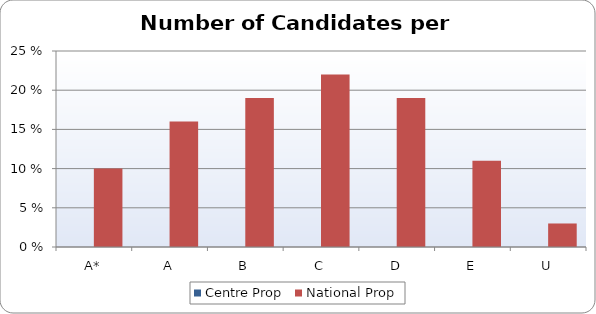
| Category | Centre Prop | National Prop |
|---|---|---|
| A* | 0 | 10 |
| A | 0 | 16 |
| B | 0 | 19 |
| C | 0 | 22 |
| D | 0 | 19 |
| E | 0 | 11 |
| U | 0 | 3 |